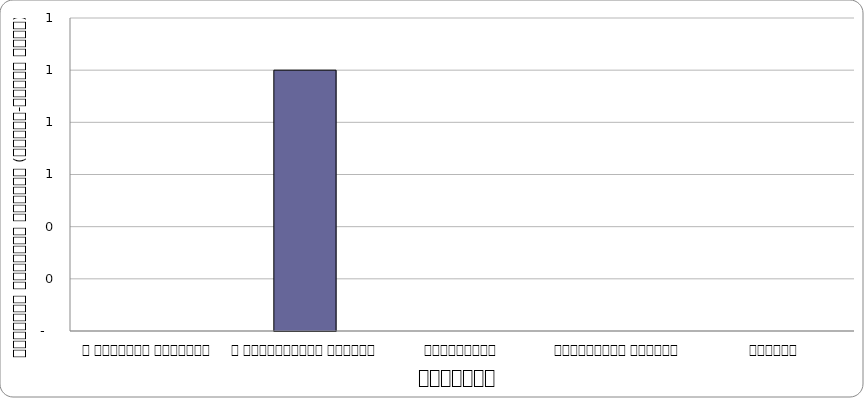
| Category | वातावरण |
|---|---|
| द हिमालयन टाइम्स् | 0 |
| द काठमाण्डौं पोस्ट् | 1 |
| कान्तिपुर | 0 |
| अन्नपूर्ण पोस्ट् | 0 |
| नागरिक | 0 |